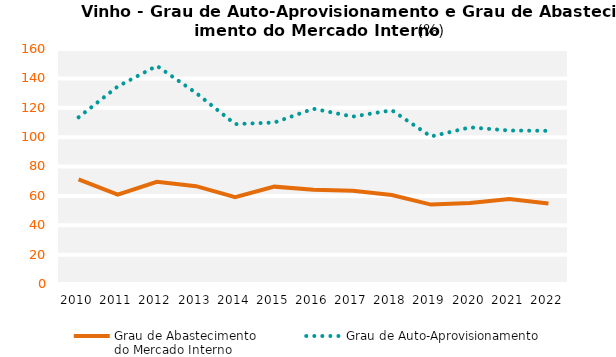
| Category | Grau de Abastecimento
do Mercado Interno | Grau de Auto-Aprovisionamento |
|---|---|---|
| 2010.0 | 71.16 | 113.5 |
| 2011.0 | 60.858 | 134.511 |
| 2012.0 | 69.578 | 148.504 |
| 2013.0 | 66.609 | 130.084 |
| 2014.0 | 59.118 | 108.877 |
| 2015.0 | 66.289 | 109.938 |
| 2016.0 | 64.246 | 119.32 |
| 2017.0 | 63.529 | 113.97 |
| 2018.0 | 60.558 | 118.29 |
| 2019.0 | 54.065 | 100.437 |
| 2020.0 | 55.146 | 106.636 |
| 2021.0 | 57.808 | 104.503 |
| 2022.0 | 54.747 | 104.297 |